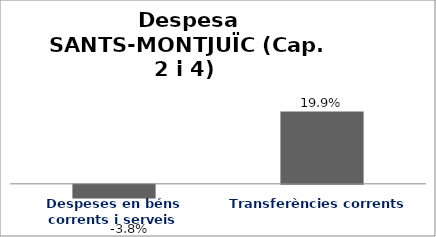
| Category | Series 0 |
|---|---|
| Despeses en béns corrents i serveis | -0.038 |
| Transferències corrents | 0.199 |